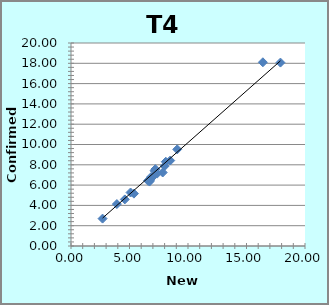
| Category | T4 |
|---|---|
| 2.7 | 2.7 |
| 7.84 | 7.24 |
| 7.21 | 7.57 |
| 7.36 | 7.13 |
| 7.14 | 7.41 |
| 6.84 | 6.79 |
| 3.92 | 4.13 |
| 9.08 | 9.52 |
| 5.09 | 5.27 |
| 5.38 | 5.16 |
| 8.1 | 8.3 |
| 7.03 | 6.87 |
| 6.71 | 6.35 |
| 6.58 | 6.43 |
| 6.77 | 6.51 |
| 8.01 | 7.88 |
| 4.6 | 4.59 |
| 8.48 | 8.42 |
| 17.9 | 18.07 |
| 16.4 | 18.1 |